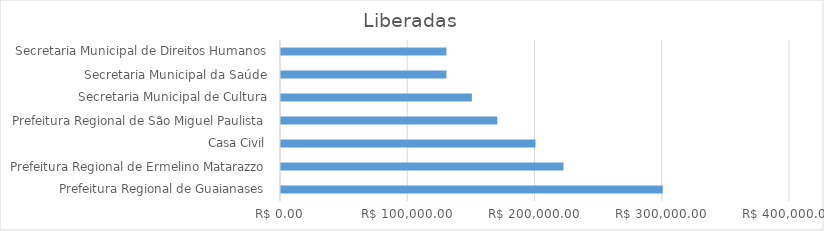
| Category | Series 0 |
|---|---|
| Prefeitura Regional de Guaianases | 300000 |
| Prefeitura Regional de Ermelino Matarazzo | 222000 |
| Casa Civil | 200000 |
| Prefeitura Regional de São Miguel Paulista | 170000 |
| Secretaria Municipal de Cultura | 150000 |
| Secretaria Municipal da Saúde | 130000 |
| Secretaria Municipal de Direitos Humanos | 130000 |